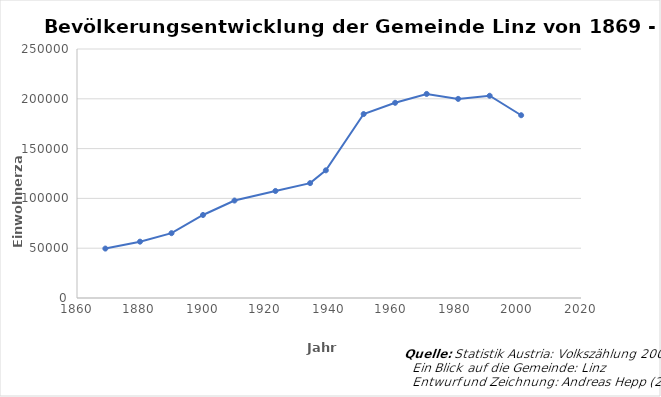
| Category | Einwohner |
|---|---|
| 1869.0 | 49635 |
| 1880.0 | 56569 |
| 1890.0 | 65090 |
| 1900.0 | 83356 |
| 1910.0 | 97852 |
| 1923.0 | 107463 |
| 1934.0 | 115338 |
| 1939.0 | 128177 |
| 1951.0 | 184685 |
| 1961.0 | 195978 |
| 1971.0 | 204889 |
| 1981.0 | 199910 |
| 1991.0 | 203044 |
| 2001.0 | 183504 |